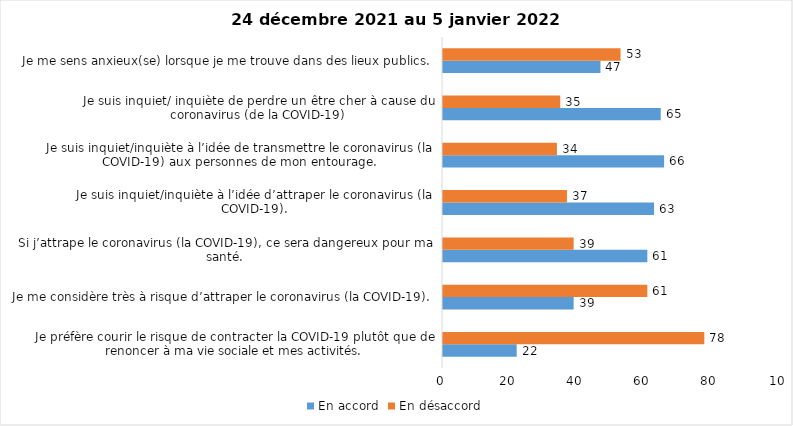
| Category | En accord | En désaccord |
|---|---|---|
| Je préfère courir le risque de contracter la COVID-19 plutôt que de renoncer à ma vie sociale et mes activités. | 22 | 78 |
| Je me considère très à risque d’attraper le coronavirus (la COVID-19). | 39 | 61 |
| Si j’attrape le coronavirus (la COVID-19), ce sera dangereux pour ma santé. | 61 | 39 |
| Je suis inquiet/inquiète à l’idée d’attraper le coronavirus (la COVID-19). | 63 | 37 |
| Je suis inquiet/inquiète à l’idée de transmettre le coronavirus (la COVID-19) aux personnes de mon entourage. | 66 | 34 |
| Je suis inquiet/ inquiète de perdre un être cher à cause du coronavirus (de la COVID-19) | 65 | 35 |
| Je me sens anxieux(se) lorsque je me trouve dans des lieux publics. | 47 | 53 |